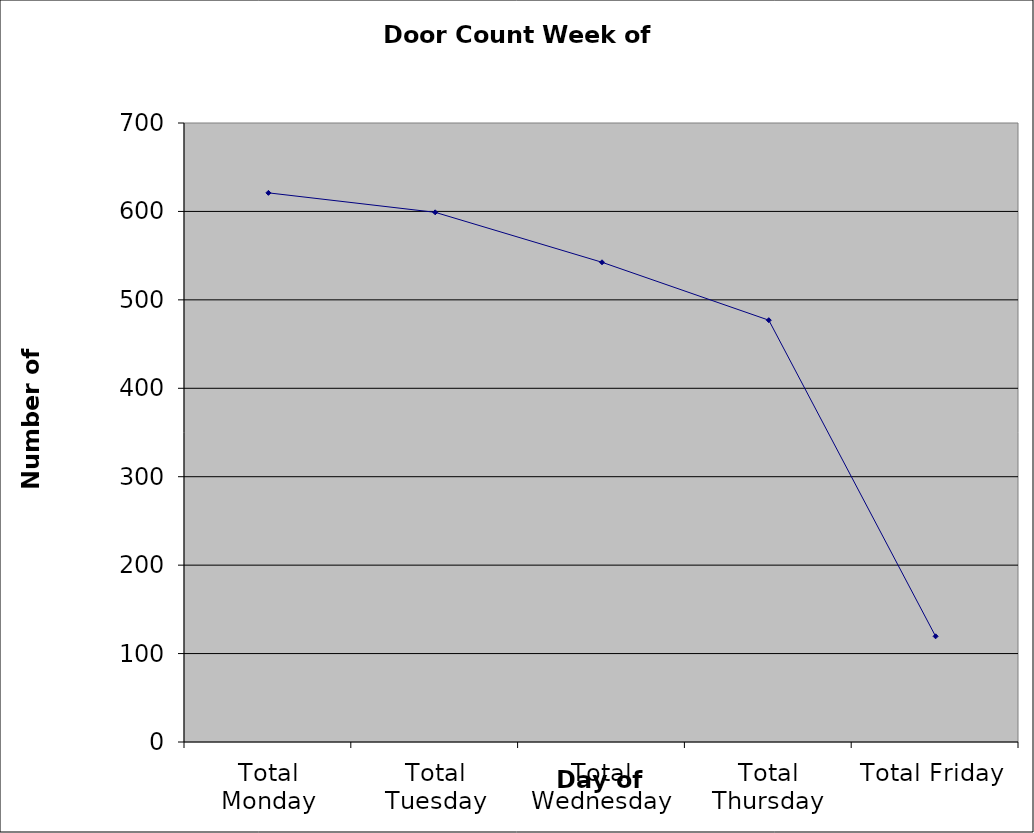
| Category | Series 0 |
|---|---|
| Total Monday | 621 |
| Total Tuesday | 599 |
| Total Wednesday | 542.5 |
| Total Thursday | 477 |
| Total Friday | 119.5 |